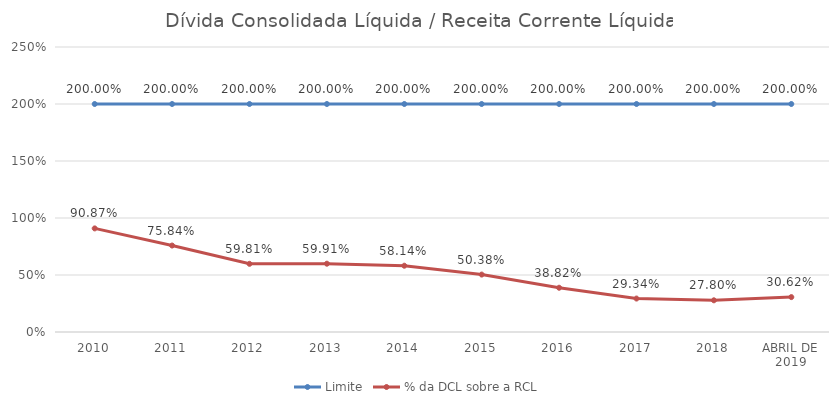
| Category | Limite | % da DCL sobre a RCL |
|---|---|---|
| 2010 | 2 | 0.909 |
| 2011 | 2 | 0.758 |
| 2012 | 2 | 0.598 |
| 2013 | 2 | 0.599 |
| 2014 | 2 | 0.581 |
| 2015 | 2 | 0.504 |
| 2016 | 2 | 0.388 |
| 2017 | 2 | 0.293 |
| 2018 | 2 | 0.278 |
| ABRIL DE 2019 | 2 | 0.306 |